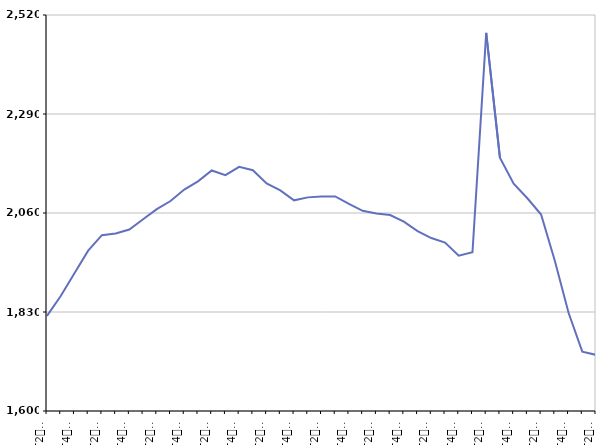
| Category | De 25 à 49 ans |
|---|---|
| T2
2012 | 1821 |
| T3
2012 | 1867.2 |
| T4
2012 | 1920.2 |
| T1
2013 | 1972.4 |
| T2
2013 | 2008.4 |
| T3
2013 | 2012.4 |
| T4
2013 | 2021.5 |
| T1
2014 | 2045.5 |
| T2
2014 | 2068.9 |
| T3
2014 | 2087.9 |
| T4
2014 | 2114.5 |
| T1
2015 | 2133.4 |
| T2
2015 | 2158.8 |
| T3
2015 | 2147.8 |
| T4
2015 | 2167.1 |
| T1
2016 | 2159.5 |
| T2
2016 | 2128.7 |
| T3
2016 | 2112.6 |
| T4
2016 | 2089.4 |
| T1
2017 | 2096.3 |
| T2
2017 | 2098.5 |
| T3
2017 | 2098.4 |
| T4
2017 | 2081.1 |
| T1
2018 | 2065.1 |
| T2
2018 | 2058.7 |
| T3
2018 | 2055.4 |
| T4
2018 | 2040.1 |
| T1
2019 | 2018 |
| T2
2019 | 2001.8 |
| T3
2019 | 1991.4 |
| T4
2019 | 1960.9 |
| T1
2020 | 1968.8 |
| T2
2020 | 2478.6 |
| T3
2020 | 2188.6 |
| T4
2020 | 2128.1 |
| T1
2021 | 2094.3 |
| T2
2021 | 2056.5 |
| T3
2021 | 1949.1 |
| T4
2021 | 1828.2 |
| T1
2022 | 1738 |
| T2
2022 | 1730.4 |